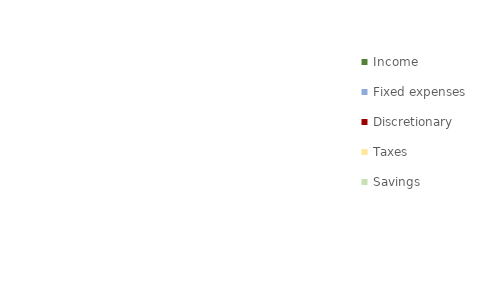
| Category | Cash flow |
|---|---|
| 0 | 0 |
| 1 | 0 |
| 2 | 0 |
| 3 | 0 |
| 4 | 0 |